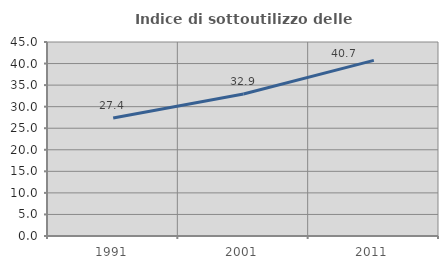
| Category | Indice di sottoutilizzo delle abitazioni  |
|---|---|
| 1991.0 | 27.36 |
| 2001.0 | 32.939 |
| 2011.0 | 40.728 |